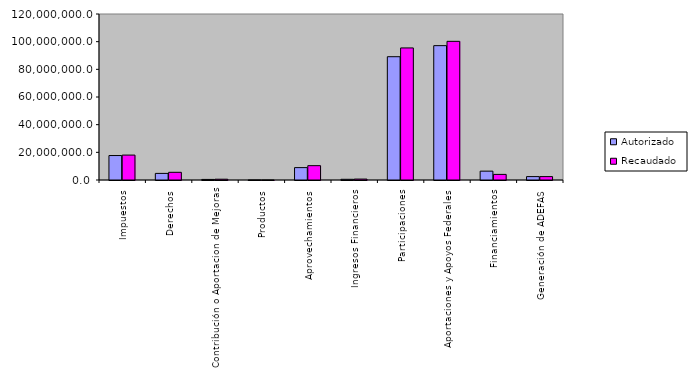
| Category | Autorizado | Recaudado |
|---|---|---|
| 0 | 17682469.3 | 18007065.7 |
| 1 | 4767760.3 | 5558337.9 |
| 2 | 407606.6 | 566661.3 |
| 3 | 38168.5 | 14894.4 |
| 4 | 8955145.3 | 10367964.2 |
| 5 | 498559.3 | 671942.6 |
| 6 | 89121174.7 | 95472245.5 |
| 7 | 97123725.7 | 100239717.9 |
| 8 | 6400000 | 4046852.8 |
| 9 | 2460700 | 2460700 |